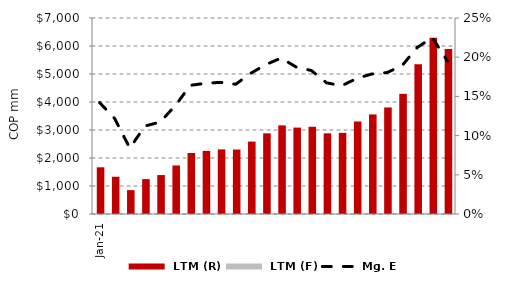
| Category |  LTM (R)  |  LTM (F)  |
|---|---|---|
| 2021-01-01 | 1668.593 |  |
| 2021-02-01 | 1330.063 |  |
| 2021-03-01 | 852.074 |  |
| 2021-04-01 | 1246.095 |  |
| 2021-05-01 | 1390.792 |  |
| 2021-06-01 | 1733.347 |  |
| 2021-07-01 | 2179.35 |  |
| 2021-08-01 | 2253.827 |  |
| 2021-09-01 | 2307.108 |  |
| 2021-10-01 | 2302.312 |  |
| 2021-11-01 | 2586.428 |  |
| 2021-12-01 | 2880.643 |  |
| 2022-01-01 | 3165.1 |  |
| 2022-02-01 | 3086.707 |  |
| 2022-03-01 | 3117.899 |  |
| 2022-04-01 | 2879.961 |  |
| 2022-05-01 | 2897.909 |  |
| 2022-06-01 | 3302.46 |  |
| 2022-07-01 | 3555.727 |  |
| 2022-08-01 | 3805.496 |  |
| 2022-09-01 | 4290.563 |  |
| 2022-10-01 | 5350.223 |  |
| 2022-11-01 | 6297.19 |  |
| 2022-12-01 | 5889.231 |  |